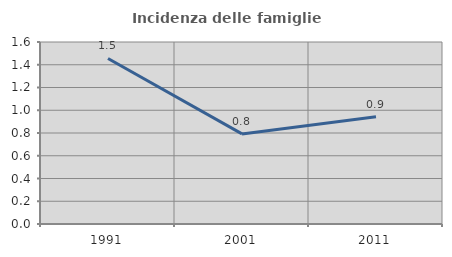
| Category | Incidenza delle famiglie numerose |
|---|---|
| 1991.0 | 1.455 |
| 2001.0 | 0.792 |
| 2011.0 | 0.943 |